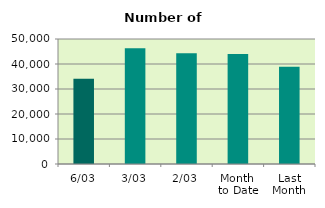
| Category | Series 0 |
|---|---|
| 6/03 | 34128 |
| 3/03 | 46262 |
| 2/03 | 44310 |
| Month 
to Date | 44015.5 |
| Last
Month | 38877.2 |